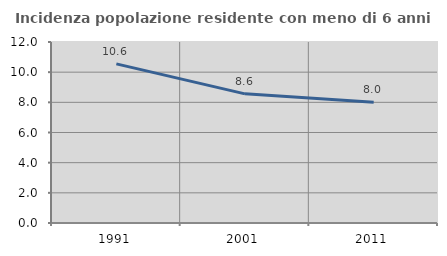
| Category | Incidenza popolazione residente con meno di 6 anni |
|---|---|
| 1991.0 | 10.552 |
| 2001.0 | 8.562 |
| 2011.0 | 8.011 |